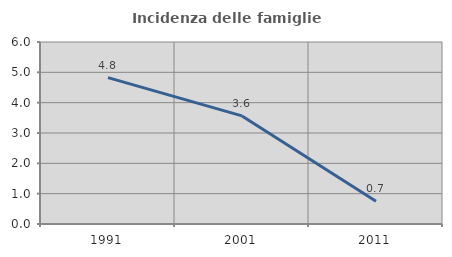
| Category | Incidenza delle famiglie numerose |
|---|---|
| 1991.0 | 4.825 |
| 2001.0 | 3.563 |
| 2011.0 | 0.748 |